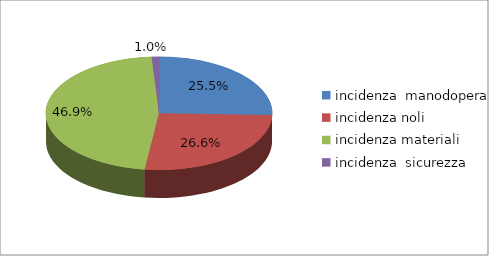
| Category | Series 0 |
|---|---|
| incidenza  manodopera  | 0.255 |
| incidenza noli  | 0.266 |
| incidenza materiali | 0.469 |
| incidenza  sicurezza | 0.01 |